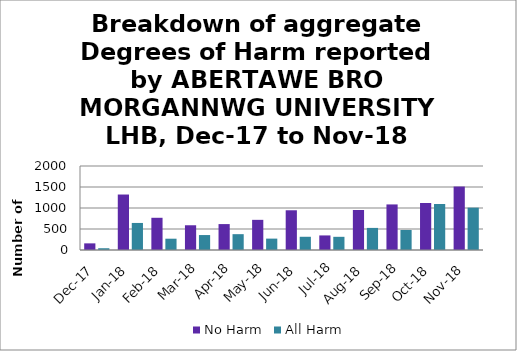
| Category | No Harm | All Harm |
|---|---|---|
| Dec-17 | 158 | 42 |
| Jan-18 | 1321 | 644 |
| Feb-18 | 767 | 269 |
| Mar-18 | 589 | 356 |
| Apr-18 | 617 | 377 |
| May-18 | 718 | 271 |
| Jun-18 | 946 | 315 |
| Jul-18 | 347 | 314 |
| Aug-18 | 953 | 526 |
| Sep-18 | 1085 | 477 |
| Oct-18 | 1119 | 1095 |
| Nov-18 | 1511 | 1008 |